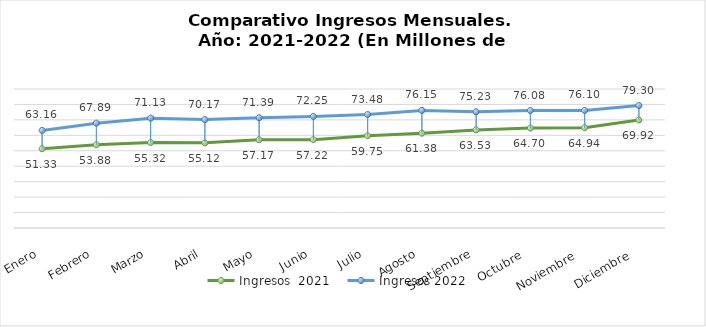
| Category | Ingresos  2021 | Ingresos 2022 |
|---|---|---|
| Enero | 51.329 | 63.161 |
| Febrero | 53.877 | 67.895 |
| Marzo | 55.319 | 71.128 |
| Abril | 55.124 | 70.172 |
| Mayo | 57.174 | 71.389 |
| Junio | 57.216 | 72.252 |
| Julio | 59.753 | 73.48 |
| Agosto | 61.378 | 76.149 |
| Septiembre | 63.529 | 75.231 |
| Octubre  | 64.699 | 76.078 |
| Noviembre  | 64.945 | 76.1 |
| Diciembre  | 69.925 | 79.301 |